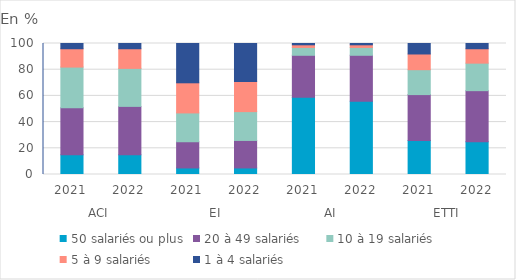
| Category | 50 salariés ou plus | 20 à 49 salariés | 10 à 19 salariés | 5 à 9 salariés | 1 à 4 salariés |
|---|---|---|---|---|---|
| 0 | 15 | 36 | 31 | 14 | 4 |
| 1 | 15 | 37 | 29 | 15 | 4 |
| 2 | 5 | 20 | 22 | 23 | 30 |
| 3 | 5 | 21 | 22 | 23 | 29 |
| 4 | 59 | 32 | 6 | 2 | 1 |
| 5 | 56 | 35 | 6 | 2 | 1 |
| 6 | 26 | 35 | 19 | 12 | 8 |
| 7 | 25 | 39 | 21 | 11 | 4 |